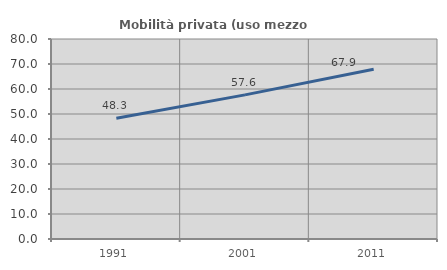
| Category | Mobilità privata (uso mezzo privato) |
|---|---|
| 1991.0 | 48.276 |
| 2001.0 | 57.641 |
| 2011.0 | 67.863 |